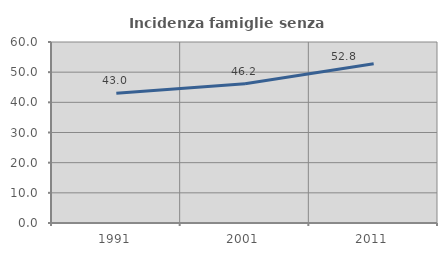
| Category | Incidenza famiglie senza nuclei |
|---|---|
| 1991.0 | 42.991 |
| 2001.0 | 46.188 |
| 2011.0 | 52.766 |